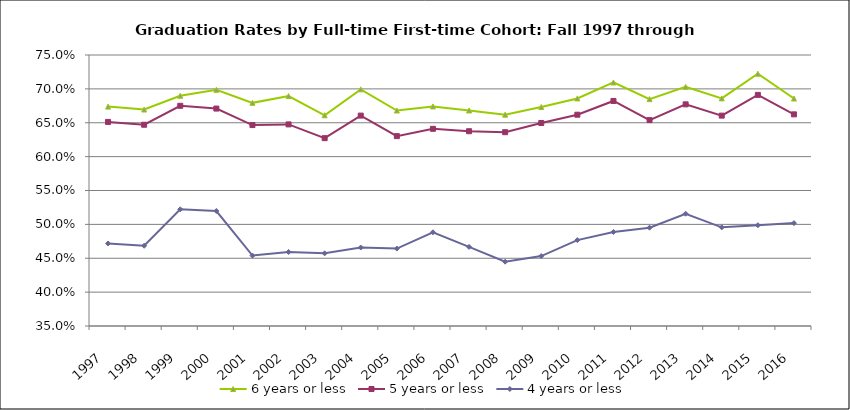
| Category | 6 years or less | 5 years or less | 4 years or less |
|---|---|---|---|
| 1997.0 | 0.674 | 0.651 | 0.472 |
| 1998.0 | 0.67 | 0.647 | 0.468 |
| 1999.0 | 0.69 | 0.675 | 0.522 |
| 2000.0 | 0.699 | 0.671 | 0.52 |
| 2001.0 | 0.679 | 0.647 | 0.454 |
| 2002.0 | 0.689 | 0.648 | 0.459 |
| 2003.0 | 0.661 | 0.627 | 0.457 |
| 2004.0 | 0.699 | 0.661 | 0.466 |
| 2005.0 | 0.668 | 0.63 | 0.464 |
| 2006.0 | 0.674 | 0.641 | 0.488 |
| 2007.0 | 0.668 | 0.637 | 0.467 |
| 2008.0 | 0.662 | 0.636 | 0.445 |
| 2009.0 | 0.673 | 0.65 | 0.453 |
| 2010.0 | 0.686 | 0.662 | 0.477 |
| 2011.0 | 0.709 | 0.682 | 0.489 |
| 2012.0 | 0.685 | 0.654 | 0.495 |
| 2013.0 | 0.703 | 0.677 | 0.516 |
| 2014.0 | 0.686 | 0.661 | 0.496 |
| 2015.0 | 0.722 | 0.691 | 0.499 |
| 2016.0 | 0.686 | 0.662 | 0.502 |